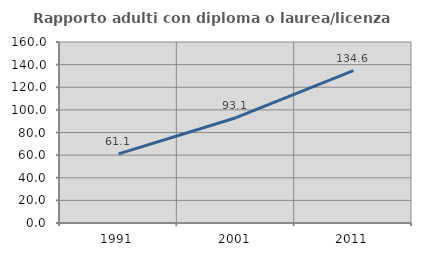
| Category | Rapporto adulti con diploma o laurea/licenza media  |
|---|---|
| 1991.0 | 61.111 |
| 2001.0 | 93.074 |
| 2011.0 | 134.621 |